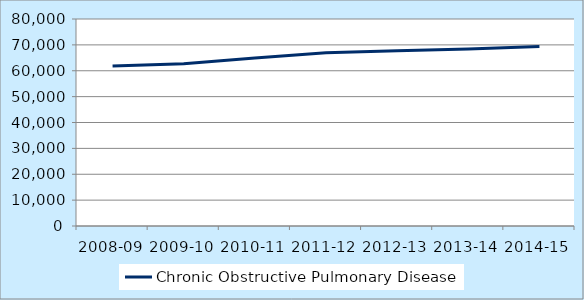
| Category | Chronic Obstructive Pulmonary Disease  |
|---|---|
| 2008-09 | 61851 |
| 2009-10 | 62744 |
| 2010-11 | 64903 |
| 2011-12 | 66951 |
| 2012-13 | 67773 |
| 2013-14 | 68419 |
| 2014-15 | 69385 |